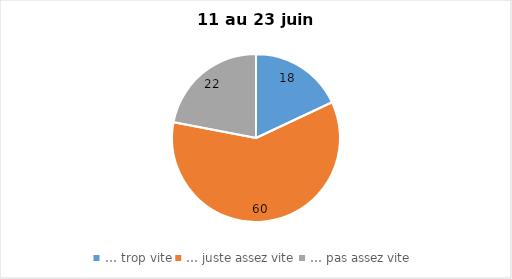
| Category | Series 0 |
|---|---|
| … trop vite | 18 |
| … juste assez vite | 60 |
| … pas assez vite | 22 |